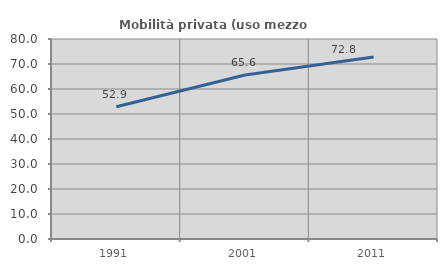
| Category | Mobilità privata (uso mezzo privato) |
|---|---|
| 1991.0 | 52.916 |
| 2001.0 | 65.622 |
| 2011.0 | 72.805 |